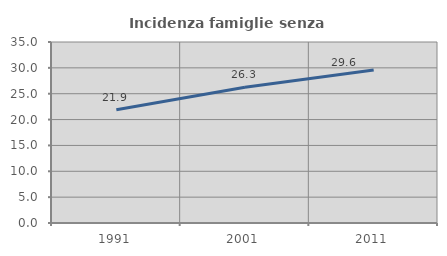
| Category | Incidenza famiglie senza nuclei |
|---|---|
| 1991.0 | 21.881 |
| 2001.0 | 26.263 |
| 2011.0 | 29.586 |